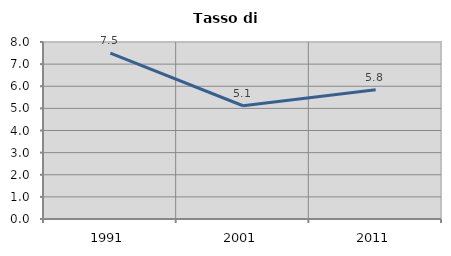
| Category | Tasso di disoccupazione   |
|---|---|
| 1991.0 | 7.5 |
| 2001.0 | 5.118 |
| 2011.0 | 5.842 |